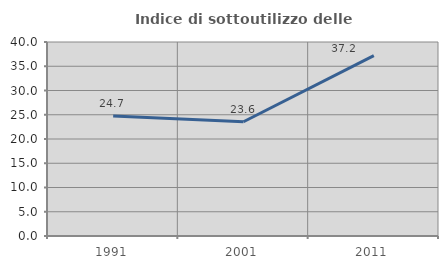
| Category | Indice di sottoutilizzo delle abitazioni  |
|---|---|
| 1991.0 | 24.725 |
| 2001.0 | 23.563 |
| 2011.0 | 37.179 |